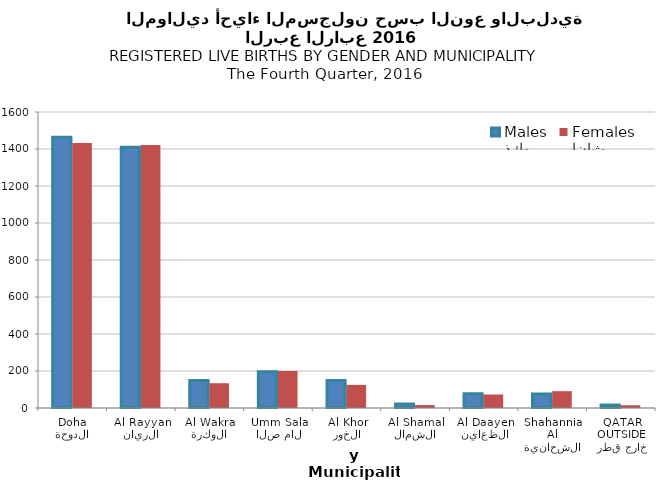
| Category | ذكور
Males | إناث
Females |
|---|---|---|
| الدوحة
Doha | 1464 | 1433 |
| الريان
Al Rayyan | 1409 | 1422 |
| الوكرة
Al Wakra | 148 | 134 |
| ام صلال
Umm Salal | 196 | 200 |
| الخور
Al Khor | 148 | 125 |
| الشمال
Al Shamal | 22 | 16 |
| الظعاين
Al Daayen | 77 | 73 |
| الشحانية
Al Shahannia | 76 | 91 |
| خارج قطر
OUTSIDE QATAR | 16 | 15 |